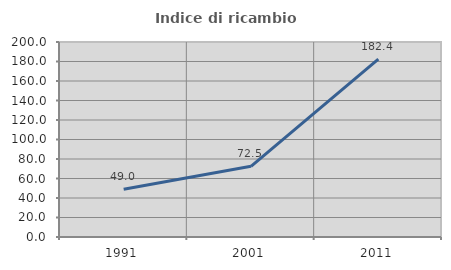
| Category | Indice di ricambio occupazionale  |
|---|---|
| 1991.0 | 48.958 |
| 2001.0 | 72.512 |
| 2011.0 | 182.353 |